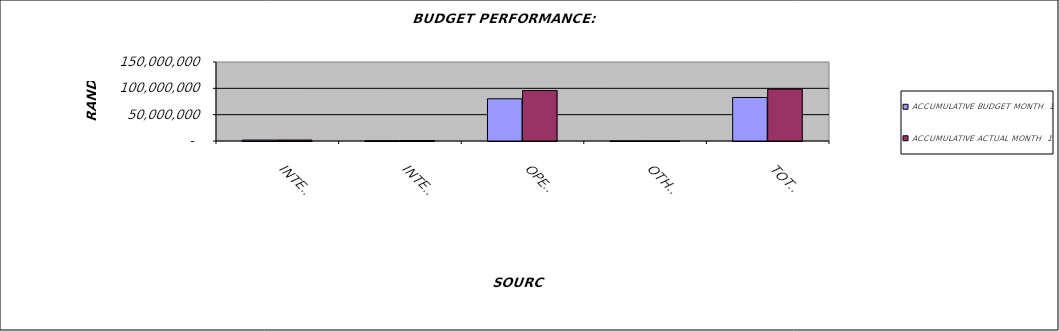
| Category | ACCUMULATIVE BUDGET MONTH  10 | ACCUMULATIVE ACTUAL MONTH  10 |
|---|---|---|
| INTEREST EARNED | 1808333.333 | 1853149 |
| INTEREST EARNED- DEBTORS | 507280 | 831698 |
| OPERATING GRANTS & SUBSIDIES | 80146009.167 | 95905544 |
| OTHER INCOME | 143940 | 50927 |
| TOTAL INCOME | 82605562.5 | 98641318 |